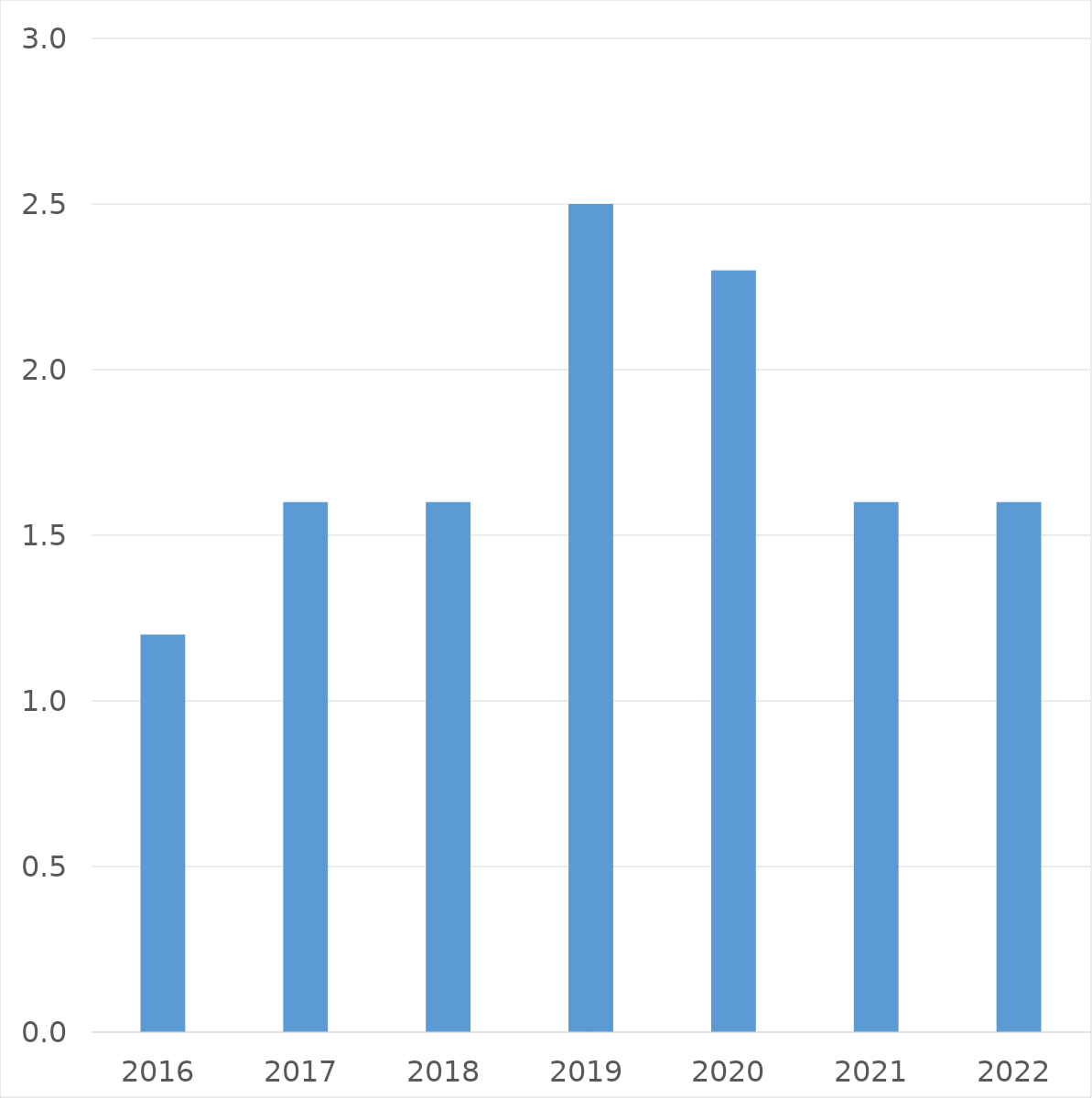
| Category | Series 0 |
|---|---|
| 2016 | 1.2 |
| 2017 | 1.6 |
| 2018 | 1.6 |
| 2019 | 2.5 |
| 2020 | 2.3 |
| 2021 | 1.6 |
| 2022 | 1.6 |